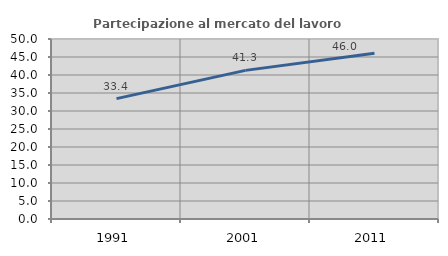
| Category | Partecipazione al mercato del lavoro  femminile |
|---|---|
| 1991.0 | 33.447 |
| 2001.0 | 41.286 |
| 2011.0 | 46.032 |